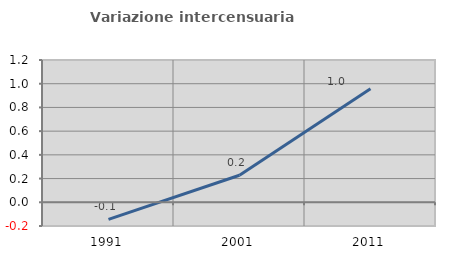
| Category | Variazione intercensuaria annua |
|---|---|
| 1991.0 | -0.144 |
| 2001.0 | 0.228 |
| 2011.0 | 0.958 |